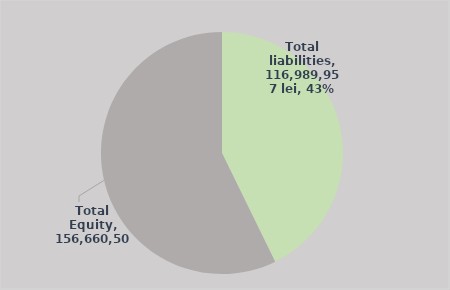
| Category | Series 0 |
|---|---|
| Total liabilities | 116989956.802 |
| Total Equity | 156660505.708 |